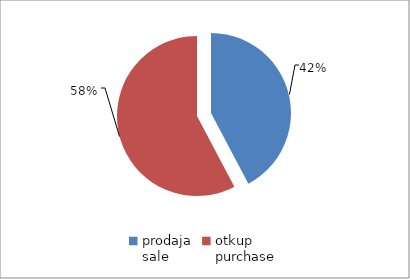
| Category | Series 0 |
|---|---|
| prodaja
sale | 126402601.5 |
| otkup
purchase | 172681525.6 |